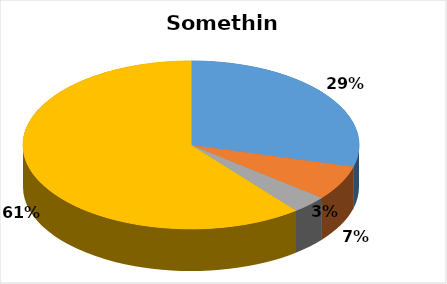
| Category | Series 0 |
|---|---|
| A | 2893 |
| B | 663 |
| C | 339 |
| n.a. | 6021 |